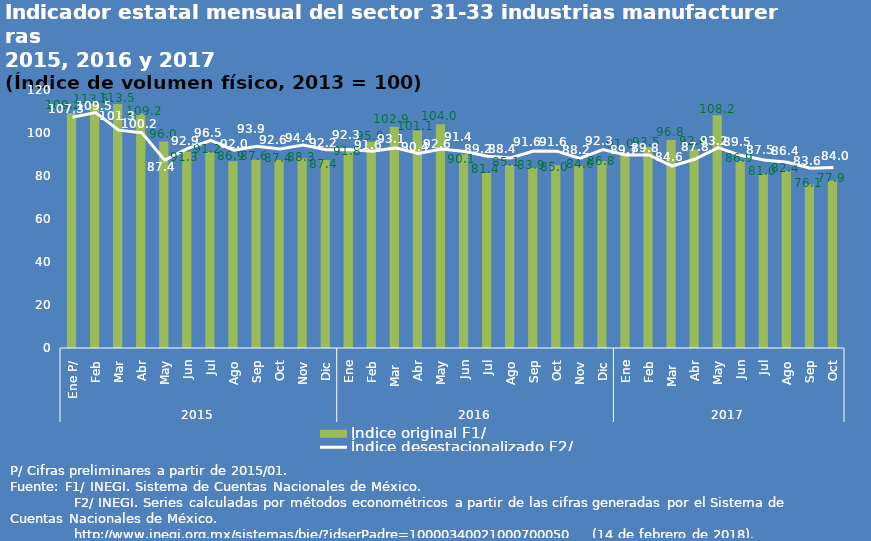
| Category | Índice original F1/ |
|---|---|
| 0 | 109.175 |
| 1 | 113.515 |
| 2 | 113.49 |
| 3 | 109.215 |
| 4 | 96.037 |
| 5 | 91.255 |
| 6 | 91.215 |
| 7 | 86.906 |
| 8 | 87.571 |
| 9 | 87.397 |
| 10 | 88.284 |
| 11 | 87.439 |
| 12 | 91.752 |
| 13 | 95.947 |
| 14 | 102.896 |
| 15 | 101.126 |
| 16 | 104.017 |
| 17 | 90.112 |
| 18 | 81.353 |
| 19 | 85.132 |
| 20 | 83.862 |
| 21 | 85.049 |
| 22 | 84.615 |
| 23 | 86.823 |
| 24 | 90.967 |
| 25 | 93.538 |
| 26 | 96.8 |
| 27 | 92.372 |
| 28 | 108.242 |
| 29 | 86.94 |
| 30 | 81.032 |
| 31 | 82.429 |
| 32 | 76.101 |
| 33 | 77.941 |